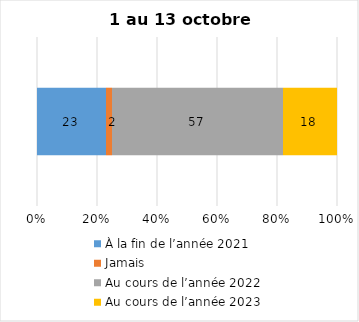
| Category | À la fin de l’année 2021 | Jamais | Au cours de l’année 2022 | Au cours de l’année 2023 |
|---|---|---|---|---|
| 0 | 23 | 2 | 57 | 18 |